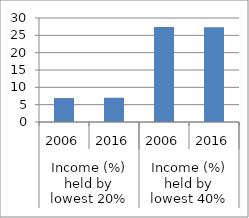
| Category | Series 0 |
|---|---|
| 0 | 6.9 |
| 1 | 7 |
| 2 | 27.4 |
| 3 | 27.3 |